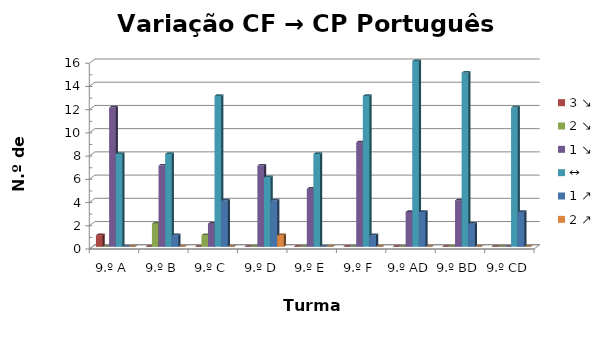
| Category | 3 ↘ | 2 ↘ | 1 ↘ | ↔ | 1 ↗ | 2 ↗ |
|---|---|---|---|---|---|---|
| 9.º A | 1 | 0 | 12 | 8 | 0 | 0 |
| 9.º B | 0 | 2 | 7 | 8 | 1 | 0 |
| 9.º C | 0 | 1 | 2 | 13 | 4 | 0 |
| 9.º D | 0 | 0 | 7 | 6 | 4 | 1 |
| 9.º E | 0 | 0 | 5 | 8 | 0 | 0 |
| 9.º F | 0 | 0 | 9 | 13 | 1 | 0 |
| 9.º AD | 0 | 0 | 3 | 16 | 3 | 0 |
| 9.º BD | 0 | 0 | 4 | 15 | 2 | 0 |
| 9.º CD | 0 | 0 | 0 | 12 | 3 | 0 |